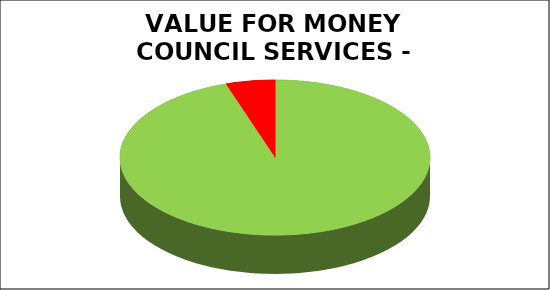
| Category | Series 0 |
|---|---|
| Green | 0.949 |
| Amber | 0 |
| Red | 0.051 |